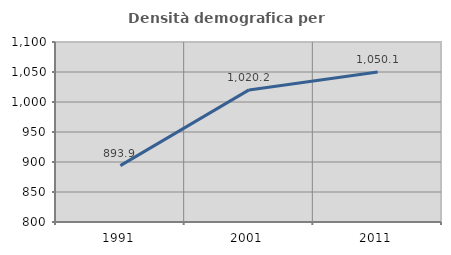
| Category | Densità demografica |
|---|---|
| 1991.0 | 893.912 |
| 2001.0 | 1020.182 |
| 2011.0 | 1050.092 |